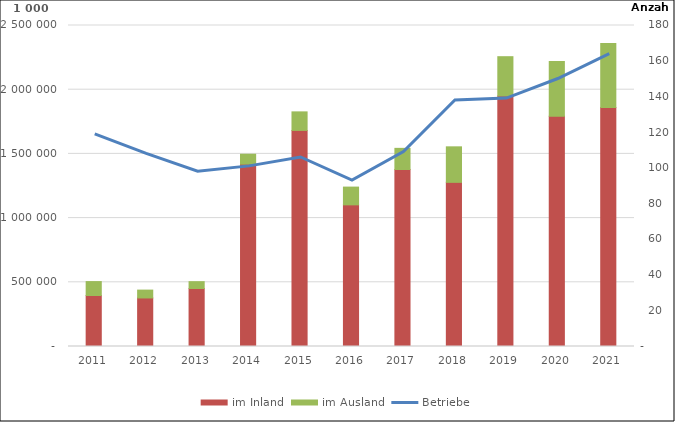
| Category | im Inland | im Ausland |
|---|---|---|
| 2011 | 397236.456 | 108321.958 |
| 2012 | 378032.569 | 61206.368 |
| 2013 | 451784.38 | 53146.283 |
| 2014 | 1420401.623 | 77084.75 |
| 2015 | 1683010.285 | 144289.831 |
| 2016 | 1103125.331 | 138341.391 |
| 2017 | 1378402.039 | 164793.669 |
| 2018 | 1278370.32 | 276718.959 |
| 2019 | 1951302.842 | 305807.369 |
| 2020 | 1793155.63 | 427264.442 |
| 2021 | 1862049.082 | 496989.59 |